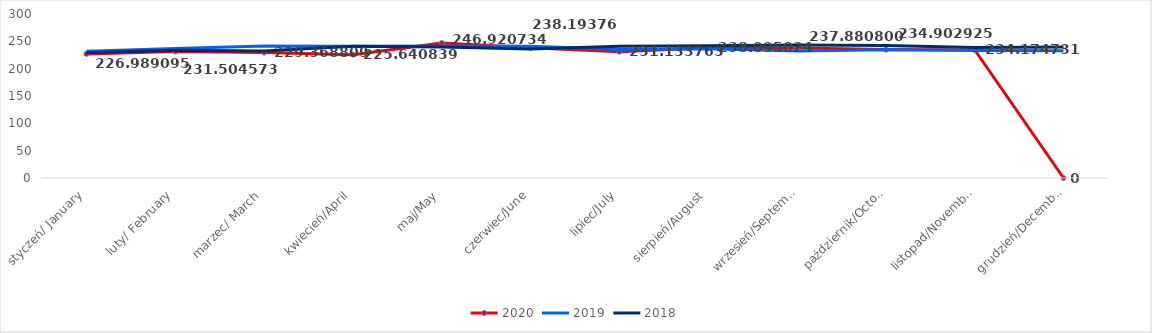
| Category | 2020 | 2019 | 2018 |
|---|---|---|---|
| styczeń/ January | 226.989 | 231.781 | 229.328 |
| luty/ February | 231.505 | 236.982 | 233.829 |
| marzec/ March | 229.369 | 241.462 | 232.544 |
| kwiecień/April | 225.641 | 241.025 | 241.196 |
| maj/May | 246.921 | 241.523 | 239.666 |
| czerwiec/June | 238.194 | 240.788 | 236.045 |
| lipiec/July | 231.134 | 235.139 | 240.878 |
| sierpień/August | 238.095 | 236.277 | 241.928 |
| wrzesień/September | 237.881 | 232.215 | 243.404 |
| październik/October | 234.903 | 234.539 | 242.474 |
| listopad/November | 234.175 | 233.035 | 238.812 |
| grudzień/December | 0 | 232.743 | 239.499 |